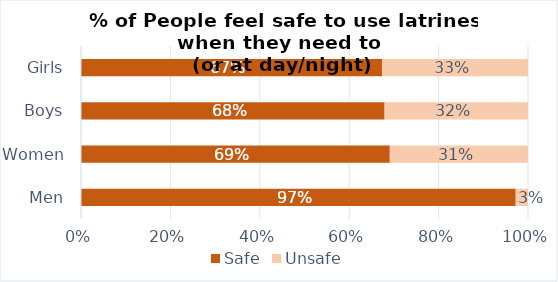
| Category | Safe | Unsafe |
|---|---|---|
| Men | 0.973 | 0.027 |
| Women | 0.691 | 0.309 |
| Boys | 0.679 | 0.321 |
| Girls | 0.673 | 0.327 |